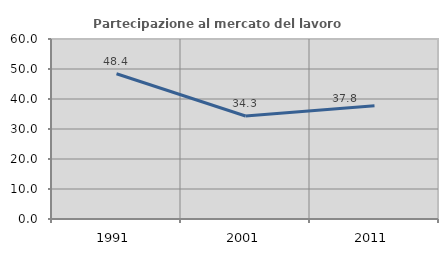
| Category | Partecipazione al mercato del lavoro  femminile |
|---|---|
| 1991.0 | 48.417 |
| 2001.0 | 34.347 |
| 2011.0 | 37.768 |